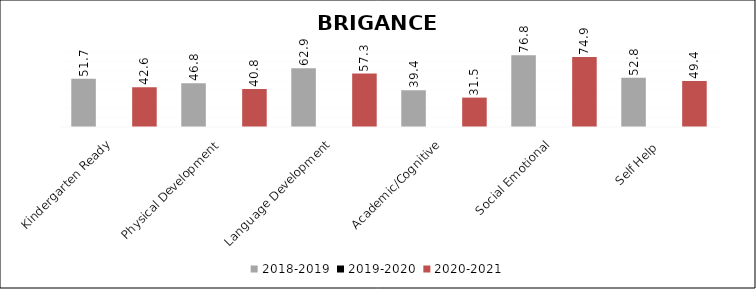
| Category | 2018-2019 | 2019-2020 | 2020-2021 |
|---|---|---|---|
| Kindergarten Ready | 51.7 | 0 | 42.6 |
| Physical Development | 46.8 | 0 | 40.8 |
| Language Development | 62.9 | 0 | 57.3 |
| Academic/Cognitive | 39.4 | 0 | 31.5 |
| Social Emotional | 76.8 | 0 | 74.9 |
| Self Help  | 52.8 | 0 | 49.4 |